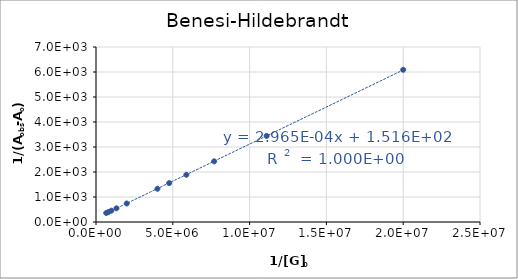
| Category | 325 nm |
|---|---|
| 20000000.0 | 6089.508 |
| 11111111.111111112 | 3443.667 |
| 7692307.692307692 | 2426.715 |
| 5882352.94117647 | 1888.832 |
| 4761904.761904762 | 1556.252 |
| 4000000.0 | 1330.417 |
| 2000000.0 | 740.9 |
| 1333333.3333333333 | 547.588 |
| 1000000.0 | 452.788 |
| 800000.0000000001 | 397.047 |
| 666666.6666666666 | 360.617 |